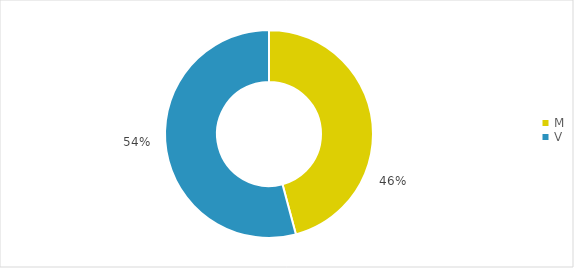
| Category | Series 1 |
|---|---|
| M | 0.458 |
| V | 0.542 |